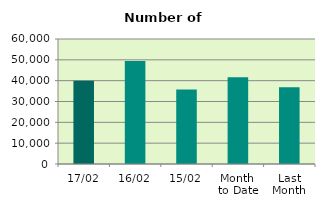
| Category | Series 0 |
|---|---|
| 17/02 | 40010 |
| 16/02 | 49470 |
| 15/02 | 35752 |
| Month 
to Date | 41596.769 |
| Last
Month | 36886.364 |